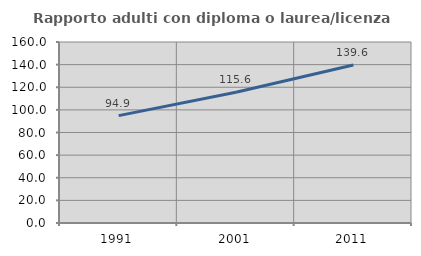
| Category | Rapporto adulti con diploma o laurea/licenza media  |
|---|---|
| 1991.0 | 94.921 |
| 2001.0 | 115.561 |
| 2011.0 | 139.617 |